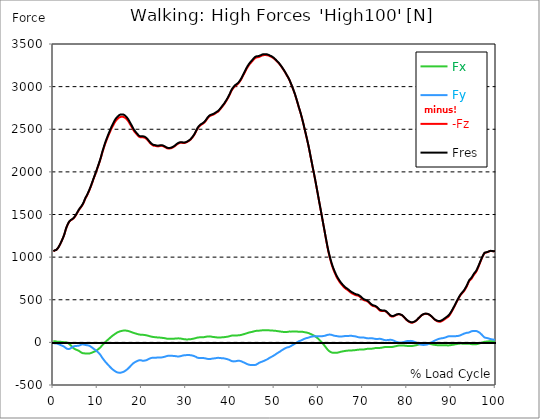
| Category |  Fx |  Fy |  -Fz |  Fres |
|---|---|---|---|---|
| 0.0 | 12.938 | -7.213 | 1069.33 | 1069.808 |
| 0.167348456675344 | 13.339 | -9.831 | 1074.685 | 1075.185 |
| 0.334696913350688 | 13.405 | -11.884 | 1079.215 | 1079.693 |
| 0.5020453700260321 | 11.732 | -11.949 | 1082.17 | 1082.659 |
| 0.669393826701376 | 9.733 | -11.634 | 1084.82 | 1085.353 |
| 0.83674228337672 | 9.049 | -14.752 | 1093.923 | 1094.532 |
| 1.0040907400520642 | 7.843 | -17.185 | 1103.537 | 1104.265 |
| 1.1621420602454444 | 6.713 | -20.639 | 1116.496 | 1117.365 |
| 1.3294905169207885 | 6.181 | -24.409 | 1131.606 | 1132.606 |
| 1.4968389735961325 | 6.224 | -28.178 | 1147.955 | 1149.095 |
| 1.6641874302714765 | 6.279 | -31.969 | 1165.639 | 1166.921 |
| 1.8315358869468206 | 6.246 | -35.445 | 1183.802 | 1185.214 |
| 1.9988843436221646 | 4.801 | -39.16 | 1203.333 | 1204.908 |
| 2.1662328002975086 | 3.672 | -42.962 | 1223.484 | 1225.232 |
| 2.333581256972853 | 2.466 | -46.927 | 1244.851 | 1246.752 |
| 2.5009297136481967 | 1.901 | -52.011 | 1269.661 | 1271.769 |
| 2.6682781703235405 | 2.194 | -59.658 | 1298.35 | 1300.826 |
| 2.8356266269988843 | 2.183 | -68.577 | 1328.407 | 1331.34 |
| 3.002975083674229 | -0.217 | -73.258 | 1352.816 | 1355.944 |
| 3.1703235403495724 | -5.138 | -75.04 | 1372.271 | 1375.508 |
| 3.337671997024917 | -9.44 | -77.777 | 1390.759 | 1394.17 |
| 3.4957233172182973 | -14.665 | -78.722 | 1407.151 | 1410.66 |
| 3.663071773893641 | -21.715 | -76.104 | 1419.502 | 1422.967 |
| 3.8304202305689854 | -29.264 | -71.966 | 1428.605 | 1431.962 |
| 3.997768687244329 | -38.215 | -66.046 | 1434.601 | 1437.871 |
| 4.165117143919673 | -47.926 | -59.539 | 1439.077 | 1442.336 |
| 4.332465600595017 | -57.236 | -53.727 | 1444.671 | 1448.147 |
| 4.499814057270361 | -65.698 | -48.948 | 1451.058 | 1454.784 |
| 4.667162513945706 | -72.292 | -46.036 | 1460.031 | 1464.072 |
| 4.834510970621049 | -78.842 | -42.495 | 1470.383 | 1474.761 |
| 5.001859427296393 | -82.839 | -41.192 | 1483.744 | 1488.274 |
| 5.169207883971737 | -86.218 | -40.811 | 1498.17 | 1502.83 |
| 5.336556340647081 | -89.205 | -41.137 | 1513.389 | 1518.19 |
| 5.503904797322425 | -92.616 | -40.247 | 1528.151 | 1533.007 |
| 5.671253253997769 | -96.353 | -39.204 | 1543.685 | 1548.595 |
| 5.82930457419115 | -101.675 | -37.335 | 1557.274 | 1562.282 |
| 5.996653030866494 | -107.335 | -34.641 | 1569.484 | 1574.633 |
| 6.164001487541838 | -113.309 | -30.818 | 1580.673 | 1586.028 |
| 6.331349944217181 | -119.403 | -26.668 | 1591.579 | 1597.184 |
| 6.498698400892526 | -124.574 | -22.747 | 1602.496 | 1608.362 |
| 6.66604685756787 | -127.279 | -21.856 | 1617.986 | 1623.961 |
| 6.833395314243213 | -128.191 | -24.452 | 1637.431 | 1643.427 |
| 7.000743770918558 | -128.68 | -27.537 | 1657.679 | 1663.675 |
| 7.168092227593902 | -129.071 | -30.915 | 1678.861 | 1684.836 |
| 7.335440684269246 | -130.625 | -31.296 | 1696.372 | 1702.379 |
| 7.50278914094459 | -130.788 | -32.349 | 1712.949 | 1718.956 |
| 7.6701375976199335 | -130.733 | -33.924 | 1730.177 | 1736.195 |
| 7.837486054295278 | -131.407 | -35.25 | 1748.166 | 1754.216 |
| 7.995537374488658 | -131.537 | -37.14 | 1766.915 | 1772.976 |
| 8.162885831164003 | -130.321 | -40.659 | 1787.369 | 1793.42 |
| 8.330234287839346 | -128.028 | -45.624 | 1809.128 | 1815.135 |
| 8.49758274451469 | -125.258 | -51.109 | 1831.907 | 1837.849 |
| 8.664931201190035 | -121.924 | -56.888 | 1855.598 | 1861.432 |
| 8.832279657865378 | -118.241 | -63.352 | 1879.898 | 1885.667 |
| 8.999628114540721 | -114.178 | -70.575 | 1904.687 | 1910.455 |
| 9.166976571216066 | -111.322 | -76.474 | 1928.129 | 1933.941 |
| 9.334325027891412 | -107.52 | -83.024 | 1951.701 | 1957.589 |
| 9.501673484566755 | -103.522 | -89.433 | 1974.85 | 1980.792 |
| 9.669021941242098 | -98.514 | -96.298 | 1998.096 | 2004.114 |
| 9.836370397917442 | -92.257 | -104.044 | 2022.798 | 2028.87 |
| 10.003718854592787 | -86.174 | -111.474 | 2047.522 | 2053.681 |
| 10.17106731126813 | -79.45 | -119.805 | 2072.43 | 2078.763 |
| 10.329118631461512 | -72.476 | -128.463 | 2098.131 | 2104.595 |
| 10.496467088136853 | -64.981 | -138.001 | 2124.224 | 2130.937 |
| 10.663815544812199 | -56.66 | -148.82 | 2151.652 | 2158.822 |
| 10.831164001487544 | -46.753 | -162.181 | 2181.981 | 2189.802 |
| 10.998512458162887 | -36.173 | -176.661 | 2213.516 | 2222.021 |
| 11.16586091483823 | -26.777 | -188.827 | 2242.248 | 2251.481 |
| 11.333209371513574 | -17.804 | -200.342 | 2269.774 | 2279.724 |
| 11.50055782818892 | -8.897 | -211.465 | 2296.724 | 2307.381 |
| 11.667906284864264 | -0.022 | -222.621 | 2322.741 | 2334.244 |
| 11.835254741539607 | 8.201 | -232.941 | 2346.628 | 2359 |
| 12.00260319821495 | 15.805 | -242.196 | 2369.135 | 2382.29 |
| 12.169951654890292 | 23.279 | -251.31 | 2391.035 | 2404.993 |
| 12.337300111565641 | 30.937 | -260.978 | 2412.424 | 2427.306 |
| 12.504648568240984 | 38.628 | -270.407 | 2432.835 | 2448.749 |
| 12.662699888434362 | 46.406 | -279.814 | 2453.213 | 2470.159 |
| 12.830048345109708 | 54.129 | -289.058 | 2473.494 | 2491.472 |
| 12.997396801785053 | 61.7 | -298.107 | 2493.242 | 2512.252 |
| 13.164745258460396 | 69.022 | -306.623 | 2511.438 | 2531.534 |
| 13.33209371513574 | 76.517 | -314.738 | 2528.546 | 2549.772 |
| 13.499442171811083 | 82.394 | -320.81 | 2543.743 | 2565.817 |
| 13.666790628486426 | 88.26 | -326.871 | 2559.321 | 2582.252 |
| 13.834139085161771 | 94.941 | -333.91 | 2576.114 | 2600.023 |
| 14.001487541837117 | 101.284 | -340.091 | 2590.236 | 2615.101 |
| 14.16883599851246 | 107.248 | -345.49 | 2602.196 | 2627.93 |
| 14.336184455187803 | 112.364 | -349.336 | 2612.07 | 2638.467 |
| 14.503532911863147 | 116.938 | -352.182 | 2620.652 | 2647.591 |
| 14.670881368538492 | 121.065 | -354.398 | 2628.788 | 2656.162 |
| 14.828932688731873 | 124.933 | -356.146 | 2636.327 | 2664.07 |
| 14.996281145407215 | 128.43 | -357.015 | 2641.704 | 2669.719 |
| 15.163629602082558 | 131.114 | -356.081 | 2644.702 | 2672.717 |
| 15.330978058757903 | 133.221 | -353.67 | 2646.158 | 2673.977 |
| 15.498326515433247 | 135.415 | -351.66 | 2646.299 | 2673.977 |
| 15.665674972108594 | 137.077 | -349.053 | 2645.767 | 2673.195 |
| 15.833023428783937 | 138.348 | -346.37 | 2644.626 | 2671.794 |
| 16.00037188545928 | 139.022 | -341.699 | 2641.182 | 2667.829 |
| 16.167720342134626 | 139.076 | -336.67 | 2636.664 | 2662.723 |
| 16.335068798809967 | 138.598 | -330.912 | 2629.983 | 2655.358 |
| 16.502417255485312 | 137.675 | -324.286 | 2621.988 | 2646.538 |
| 16.669765712160658 | 136.176 | -317.225 | 2612.385 | 2636.044 |
| 16.837114168836 | 134.514 | -310.11 | 2602.239 | 2625.008 |
| 17.004462625511344 | 132.08 | -301.615 | 2589.378 | 2611.093 |
| 17.16251394570472 | 129.788 | -292.903 | 2575.669 | 2596.33 |
| 17.32986240238007 | 126.638 | -283.431 | 2559.788 | 2579.33 |
| 17.497210859055414 | 123.401 | -275.034 | 2545.655 | 2564.231 |
| 17.664559315730756 | 120.153 | -266.04 | 2531.175 | 2548.719 |
| 17.8319077724061 | 117.046 | -256.665 | 2515.142 | 2531.642 |
| 17.999256229081443 | 114.135 | -248.192 | 2498.848 | 2514.457 |
| 18.166604685756788 | 111.376 | -241.414 | 2484.77 | 2499.641 |
| 18.333953142432133 | 108.258 | -235.266 | 2472.31 | 2486.464 |
| 18.501301599107478 | 105.553 | -230.845 | 2462.392 | 2476.068 |
| 18.668650055782823 | 103.012 | -225.804 | 2452.062 | 2465.217 |
| 18.835998512458165 | 100.1 | -221.448 | 2442.025 | 2454.691 |
| 19.00334696913351 | 97.819 | -217.701 | 2432.531 | 2444.784 |
| 19.170695425808855 | 95.723 | -214.138 | 2422.841 | 2434.714 |
| 19.338043882484197 | 93.365 | -210.336 | 2413.26 | 2424.742 |
| 19.496095202677576 | 91.388 | -208.793 | 2407.785 | 2419.072 |
| 19.66344365935292 | 90.27 | -209.26 | 2405.754 | 2417.051 |
| 19.830792116028263 | 89.357 | -210.064 | 2404.917 | 2416.258 |
| 19.998140572703612 | 88.933 | -213.355 | 2407.09 | 2418.691 |
| 20.165489029378953 | 88.76 | -216.158 | 2407.09 | 2418.93 |
| 20.3328374860543 | 88.238 | -215.952 | 2404.722 | 2416.53 |
| 20.500185942729644 | 87.532 | -214.724 | 2402.81 | 2414.477 |
| 20.667534399404985 | 86.381 | -213.529 | 2400.398 | 2411.935 |
| 20.83488285608033 | 84.773 | -211.878 | 2396.021 | 2407.372 |
| 21.002231312755672 | 83.187 | -209.586 | 2389.232 | 2400.366 |
| 21.16957976943102 | 81.525 | -206.316 | 2381.823 | 2392.664 |
| 21.336928226106362 | 79.233 | -201.895 | 2372.101 | 2382.551 |
| 21.504276682781704 | 76.409 | -196.725 | 2360.869 | 2370.906 |
| 21.67162513945705 | 74.117 | -192.89 | 2350.462 | 2360.185 |
| 21.82967645965043 | 71.672 | -188.784 | 2340.566 | 2349.908 |
| 21.997024916325774 | 69.272 | -185.156 | 2331.572 | 2340.588 |
| 22.16437337300112 | 67.099 | -182.516 | 2323.697 | 2332.463 |
| 22.33172182967646 | 65.394 | -180.528 | 2316.744 | 2325.348 |
| 22.499070286351806 | 63.58 | -179.963 | 2310.987 | 2319.514 |
| 22.666418743027148 | 62.559 | -179.236 | 2307.348 | 2315.821 |
| 22.833767199702496 | 61.624 | -179.007 | 2305.827 | 2314.257 |
| 23.00111565637784 | 60.951 | -179.496 | 2305.349 | 2313.779 |
| 23.168464113053183 | 60.18 | -179.551 | 2304.165 | 2312.562 |
| 23.335812569728528 | 58.996 | -178.703 | 2301.2 | 2309.488 |
| 23.50316102640387 | 57.768 | -178.377 | 2298.343 | 2306.566 |
| 23.670509483079215 | 57.247 | -178.269 | 2298.908 | 2307.12 |
| 23.83785793975456 | 56.769 | -178.28 | 2300.146 | 2308.337 |
| 23.995909259947936 | 56.497 | -178.356 | 2302.406 | 2310.585 |
| 24.163257716623285 | 56.074 | -178.16 | 2304.6 | 2312.747 |
| 24.330606173298627 | 54.857 | -177.063 | 2305.773 | 2313.79 |
| 24.49795462997397 | 53.771 | -176.107 | 2306.066 | 2313.985 |
| 24.665303086649313 | 52.728 | -174.782 | 2304.078 | 2311.867 |
| 24.83265154332466 | 51.805 | -173.174 | 2300.483 | 2308.141 |
| 25.0 | 50.849 | -171.23 | 2296.735 | 2304.22 |
| 25.167348456675345 | 49.252 | -168.818 | 2292.759 | 2300.07 |
| 25.334696913350694 | 47.296 | -166.092 | 2288.078 | 2295.182 |
| 25.502045370026035 | 45.298 | -163.072 | 2282.755 | 2289.642 |
| 25.669393826701377 | 43.473 | -160.226 | 2277.877 | 2284.558 |
| 25.836742283376722 | 42.256 | -158.075 | 2274.716 | 2281.234 |
| 26.004090740052067 | 41.528 | -156.837 | 2273.75 | 2280.191 |
| 26.17143919672741 | 41.344 | -156.706 | 2274.228 | 2280.68 |
| 26.329490516920792 | 41.061 | -156.619 | 2274.619 | 2281.082 |
| 26.49683897359613 | 40.866 | -156.641 | 2275.466 | 2281.951 |
| 26.66418743027148 | 41.083 | -156.967 | 2278.138 | 2284.656 |
| 26.831535886946828 | 41.583 | -157.738 | 2282.299 | 2288.871 |
| 26.998884343622166 | 42.061 | -158.444 | 2286.513 | 2293.107 |
| 27.166232800297514 | 42.615 | -159.074 | 2290.945 | 2297.572 |
| 27.333581256972852 | 43.473 | -159.878 | 2296.485 | 2303.155 |
| 27.5009297136482 | 44.331 | -160.66 | 2302.677 | 2309.39 |
| 27.668278170323543 | 45.352 | -162.138 | 2310.607 | 2317.418 |
| 27.835626626998888 | 46.308 | -163.691 | 2318.439 | 2325.337 |
| 28.002975083674233 | 46.84 | -164.712 | 2324.783 | 2331.724 |
| 28.170323540349575 | 47.036 | -164.984 | 2329.975 | 2336.906 |
| 28.33767199702492 | 46.971 | -165.081 | 2334.635 | 2341.544 |
| 28.50502045370026 | 46.677 | -164.462 | 2338.85 | 2345.683 |
| 28.663071773893645 | 45.808 | -162.681 | 2341.24 | 2347.91 |
| 28.830420230568986 | 44.526 | -160.508 | 2342.294 | 2348.768 |
| 28.99776868724433 | 42.756 | -157.901 | 2341.403 | 2347.671 |
| 29.165117143919673 | 40.963 | -155.663 | 2340.208 | 2346.291 |
| 29.33246560059502 | 39.258 | -153.817 | 2339.176 | 2345.107 |
| 29.499814057270367 | 37.716 | -152.166 | 2338.72 | 2344.51 |
| 29.66716251394571 | 36.455 | -150.905 | 2339.361 | 2345.031 |
| 29.834510970621054 | 35.5 | -149.841 | 2340.979 | 2346.541 |
| 30.00185942729639 | 35.011 | -149.233 | 2343.945 | 2349.43 |
| 30.169207883971744 | 34.967 | -149.428 | 2347.79 | 2353.265 |
| 30.33655634064708 | 35.076 | -149.439 | 2353.069 | 2358.512 |
| 30.50390479732243 | 35.228 | -149.363 | 2358.62 | 2364.041 |
| 30.671253253997772 | 35.402 | -149.004 | 2363.997 | 2369.385 |
| 30.829304574191156 | 36.075 | -149.309 | 2370.439 | 2375.827 |
| 30.996653030866494 | 36.89 | -149.808 | 2377.196 | 2382.616 |
| 31.164001487541842 | 38.193 | -151.438 | 2386.223 | 2391.752 |
| 31.331349944217187 | 39.769 | -153.23 | 2396.379 | 2402.028 |
| 31.498698400892525 | 41.583 | -155.468 | 2407.666 | 2413.466 |
| 31.666046857567874 | 43.44 | -157.988 | 2419.68 | 2425.644 |
| 31.833395314243212 | 45.341 | -160.812 | 2432.096 | 2438.255 |
| 32.00074377091856 | 47.372 | -164.278 | 2447.315 | 2453.745 |
| 32.1680922275939 | 49.762 | -168.253 | 2463.5 | 2470.235 |
| 32.33544068426925 | 52.75 | -173.478 | 2481.359 | 2488.506 |
| 32.50278914094459 | 55.183 | -177.823 | 2498.554 | 2506.082 |
| 32.670137597619934 | 56.888 | -180.724 | 2513.284 | 2521.073 |
| 32.83748605429528 | 58.094 | -182.668 | 2525.244 | 2533.163 |
| 33.004834510970625 | 58.757 | -183.483 | 2534.575 | 2542.538 |
| 33.162885831164004 | 59.43 | -183.917 | 2542.94 | 2550.913 |
| 33.33023428783935 | 59.691 | -183.983 | 2550.152 | 2558.137 |
| 33.497582744514695 | 59.745 | -183.972 | 2555.323 | 2563.296 |
| 33.664931201190036 | 59.952 | -183.852 | 2560.44 | 2568.391 |
| 33.83227965786538 | 60.212 | -183.7 | 2565.621 | 2573.551 |
| 33.99962811454073 | 60.918 | -184.222 | 2571.911 | 2579.873 |
| 34.16697657121607 | 62.244 | -185.503 | 2579.916 | 2587.944 |
| 34.33432502789141 | 64.025 | -187.176 | 2589.921 | 2598.068 |
| 34.50167348456676 | 65.861 | -189.077 | 2601.153 | 2609.42 |
| 34.6690219412421 | 67.686 | -191.38 | 2614.145 | 2622.585 |
| 34.83637039791744 | 68.685 | -193.39 | 2626.3 | 2634.882 |
| 35.00371885459279 | 69.739 | -195.182 | 2637.207 | 2645.929 |
| 35.17106731126814 | 70.358 | -196.073 | 2646.494 | 2655.271 |
| 35.338415767943474 | 70.369 | -195.942 | 2653.859 | 2662.582 |
| 35.49646708813686 | 69.522 | -194.987 | 2659.063 | 2667.677 |
| 35.6638155448122 | 68.088 | -193.433 | 2662.919 | 2671.359 |
| 35.831164001487544 | 66.274 | -191.445 | 2665.58 | 2673.792 |
| 35.998512458162885 | 64.253 | -189.371 | 2667.416 | 2675.411 |
| 36.165860914838234 | 63.221 | -188.697 | 2671.533 | 2679.43 |
| 36.333209371513576 | 62.341 | -188.284 | 2676.421 | 2684.264 |
| 36.50055782818892 | 60.984 | -186.992 | 2681.57 | 2689.272 |
| 36.667906284864266 | 60.169 | -185.764 | 2688.044 | 2695.605 |
| 36.83525474153961 | 59.3 | -184.222 | 2694.269 | 2701.688 |
| 37.002603198214956 | 58.04 | -182.331 | 2698.853 | 2706.098 |
| 37.1699516548903 | 57.149 | -181.408 | 2704.013 | 2711.182 |
| 37.337300111565646 | 56.834 | -181.397 | 2711.921 | 2719.068 |
| 37.50464856824098 | 57.116 | -182.049 | 2721.165 | 2728.334 |
| 37.66269988843437 | 57.66 | -182.929 | 2730.898 | 2738.111 |
| 37.83004834510971 | 57.866 | -183.95 | 2741.706 | 2748.963 |
| 37.99739680178505 | 58.572 | -185.243 | 2753.134 | 2760.456 |
| 38.16474525846039 | 59.484 | -186.34 | 2763.91 | 2771.318 |
| 38.33209371513574 | 60.115 | -186.774 | 2774.816 | 2782.235 |
| 38.49944217181109 | 60.669 | -187.274 | 2785.929 | 2793.37 |
| 38.666790628486424 | 61.472 | -188.545 | 2797.693 | 2805.21 |
| 38.83413908516178 | 62.678 | -190.848 | 2811.076 | 2818.723 |
| 39.001487541837115 | 63.688 | -192.966 | 2824.578 | 2832.356 |
| 39.16883599851246 | 64.742 | -194.856 | 2838.342 | 2846.239 |
| 39.336184455187805 | 66.317 | -197.344 | 2853.169 | 2861.218 |
| 39.503532911863154 | 68.24 | -200.266 | 2868.486 | 2876.752 |
| 39.670881368538495 | 70.152 | -203.275 | 2884.378 | 2892.851 |
| 39.83822982521384 | 72.205 | -206.447 | 2901.237 | 2909.916 |
| 39.996281145407224 | 74.931 | -211.27 | 2920.54 | 2929.567 |
| 40.163629602082565 | 77.571 | -216.115 | 2939.8 | 2949.196 |
| 40.33097805875791 | 79.722 | -219.851 | 2956.387 | 2966.066 |
| 40.498326515433256 | 81.004 | -221.915 | 2970.215 | 2980.035 |
| 40.6656749721086 | 81.308 | -222.6 | 2981.643 | 2991.496 |
| 40.83302342878393 | 81.742 | -223.175 | 2992.213 | 3002.076 |
| 41.00037188545929 | 81.514 | -222.578 | 3001.554 | 3011.32 |
| 41.16772034213463 | 81.503 | -221.698 | 3010.19 | 3019.837 |
| 41.33506879880997 | 81.84 | -220.069 | 3016.567 | 3026.072 |
| 41.50241725548531 | 81.764 | -217.842 | 3021.987 | 3031.297 |
| 41.66976571216066 | 81.992 | -215.995 | 3028.972 | 3038.14 |
| 41.837114168836 | 82.459 | -215.039 | 3037.434 | 3046.526 |
| 42.004462625511344 | 83.252 | -215.441 | 3047.906 | 3057.031 |
| 42.17181108218669 | 84.393 | -217.244 | 3060.648 | 3069.892 |
| 42.32986240238007 | 85.751 | -219.308 | 3073.759 | 3083.156 |
| 42.497210859055414 | 87.815 | -222.263 | 3088.196 | 3097.831 |
| 42.66455931573076 | 90.378 | -226.543 | 3104.99 | 3114.94 |
| 42.831907772406105 | 92.996 | -230.53 | 3121.99 | 3132.244 |
| 42.999256229081446 | 95.31 | -233.919 | 3138.566 | 3149.082 |
| 43.16660468575679 | 97.287 | -237.808 | 3155.61 | 3166.408 |
| 43.33395314243214 | 99.916 | -241.946 | 3172.545 | 3183.669 |
| 43.50130159910748 | 103.044 | -246.085 | 3189.784 | 3201.255 |
| 43.66865005578282 | 106.151 | -250.311 | 3206.557 | 3218.386 |
| 43.83599851245817 | 108.78 | -254.417 | 3221.286 | 3233.453 |
| 44.00334696913351 | 111.517 | -258.251 | 3235.028 | 3247.531 |
| 44.17069542580886 | 114.341 | -261.228 | 3248.335 | 3261.12 |
| 44.3380438824842 | 116.927 | -263.52 | 3260.892 | 3273.916 |
| 44.49609520267758 | 118.795 | -264.736 | 3271.462 | 3284.605 |
| 44.66344365935292 | 120.044 | -264.356 | 3280.793 | 3293.926 |
| 44.83079211602827 | 121.75 | -264.443 | 3290.374 | 3303.55 |
| 44.99814057270361 | 124.02 | -264.964 | 3300.335 | 3313.609 |
| 45.16548902937895 | 126.486 | -265.66 | 3310.654 | 3324.037 |
| 45.332837486054295 | 129.06 | -266.04 | 3320.311 | 3333.781 |
| 45.500185942729644 | 131.255 | -265.757 | 3328.991 | 3342.493 |
| 45.66753439940499 | 133.449 | -264.704 | 3336.051 | 3349.51 |
| 45.83488285608033 | 135.469 | -262.108 | 3341.429 | 3354.746 |
| 46.00223131275568 | 136.154 | -257.132 | 3343.797 | 3356.745 |
| 46.16957976943102 | 136.186 | -251.788 | 3344.72 | 3357.299 |
| 46.336928226106366 | 136.317 | -246.237 | 3345.752 | 3357.951 |
| 46.50427668278171 | 136.893 | -240.143 | 3347.49 | 3359.32 |
| 46.671625139457056 | 138.142 | -236.569 | 3351.705 | 3363.317 |
| 46.829676459650436 | 139.282 | -233.05 | 3355.724 | 3367.162 |
| 46.99702491632577 | 140.26 | -229.508 | 3359.874 | 3371.116 |
| 47.16437337300112 | 141.27 | -226.271 | 3364.686 | 3375.722 |
| 47.33172182967646 | 141.629 | -222.578 | 3368.075 | 3378.872 |
| 47.49907028635181 | 142.117 | -219.656 | 3369.27 | 3379.926 |
| 47.66641874302716 | 142.313 | -216.104 | 3369.856 | 3380.328 |
| 47.83376719970249 | 142.291 | -212.106 | 3370.269 | 3380.534 |
| 48.001115656377834 | 142.389 | -207.957 | 3370.269 | 3380.296 |
| 48.16846411305319 | 142.367 | -203.742 | 3369.639 | 3379.383 |
| 48.33581256972853 | 142.27 | -199.668 | 3368.759 | 3378.232 |
| 48.50316102640387 | 141.987 | -195.041 | 3366.956 | 3376.124 |
| 48.67050948307921 | 141.498 | -189.501 | 3364.056 | 3372.865 |
| 48.837857939754564 | 140.597 | -183.255 | 3359.787 | 3368.227 |
| 49.005206396429905 | 140.162 | -177.367 | 3355.518 | 3363.632 |
| 49.163257716623285 | 140.054 | -173.402 | 3352.259 | 3360.189 |
| 49.33060617329863 | 139.88 | -169.546 | 3348.598 | 3356.311 |
| 49.49795462997397 | 139.174 | -164.842 | 3343.427 | 3350.868 |
| 49.66530308664932 | 138.077 | -159.509 | 3337.54 | 3344.655 |
| 49.832651543324666 | 137.544 | -154.447 | 3331.163 | 3338.018 |
| 50.0 | 136.73 | -149.091 | 3323.798 | 3330.392 |
| 50.16734845667534 | 135.828 | -143.606 | 3316.031 | 3322.354 |
| 50.33469691335069 | 134.85 | -137.751 | 3307.808 | 3313.848 |
| 50.50204537002604 | 133.612 | -131.385 | 3298.532 | 3304.256 |
| 50.66939382670139 | 132.037 | -125.965 | 3289.602 | 3295.066 |
| 50.836742283376715 | 130.766 | -120.555 | 3281.466 | 3286.702 |
| 51.00409074005207 | 129.951 | -115.601 | 3272.515 | 3277.577 |
| 51.17143919672741 | 128.691 | -110.17 | 3261.707 | 3266.541 |
| 51.32949051692079 | 127.062 | -104.348 | 3250.16 | 3254.744 |
| 51.496838973596134 | 125.584 | -97.939 | 3238.417 | 3242.74 |
| 51.66418743027148 | 124.498 | -92.301 | 3226.196 | 3230.324 |
| 51.831535886946824 | 123.651 | -87.13 | 3213.541 | 3217.506 |
| 51.99888434362217 | 122.793 | -81.797 | 3200.473 | 3204.243 |
| 52.16623280029752 | 121.967 | -76.441 | 3187.503 | 3191.066 |
| 52.33358125697285 | 121.478 | -71.705 | 3173.718 | 3177.162 |
| 52.5009297136482 | 121.37 | -67.545 | 3158.967 | 3162.356 |
| 52.668278170323546 | 121.239 | -63.254 | 3143.574 | 3146.898 |
| 52.835626626998895 | 121.63 | -59.517 | 3128.051 | 3131.354 |
| 53.00297508367424 | 123.575 | -57.757 | 3113.658 | 3117.015 |
| 53.17032354034958 | 125.302 | -56.052 | 3098.494 | 3101.883 |
| 53.33767199702492 | 126.562 | -54.021 | 3081.83 | 3085.219 |
| 53.50502045370027 | 126.421 | -49.371 | 3061.441 | 3064.732 |
| 53.663071773893655 | 126.008 | -44.233 | 3040.226 | 3043.441 |
| 53.83042023056899 | 126.051 | -39.312 | 3018.978 | 3022.129 |
| 53.99776868724433 | 126.28 | -34.565 | 2997.22 | 3000.349 |
| 54.16511714391967 | 126.551 | -29.34 | 2974.941 | 2978.037 |
| 54.33246560059503 | 126.92 | -24.257 | 2951.282 | 2954.399 |
| 54.49981405727037 | 127.583 | -19.553 | 2927.242 | 2930.393 |
| 54.667162513945705 | 128.539 | -14.795 | 2902.421 | 2905.625 |
| 54.834510970621054 | 128.441 | -9.114 | 2874.862 | 2878.078 |
| 55.0018594272964 | 127.561 | -3.009 | 2845.793 | 2849.009 |
| 55.169207883971744 | 126.486 | 2.683 | 2816.573 | 2819.788 |
| 55.336556340647086 | 125.291 | 8.169 | 2786.287 | 2789.503 |
| 55.50390479732243 | 124.531 | 13.209 | 2755.969 | 2759.185 |
| 55.671253253997776 | 124.976 | 16.348 | 2728.552 | 2731.789 |
| 55.83860171067312 | 125.541 | 18.749 | 2701.004 | 2704.284 |
| 55.9966530308665 | 125.356 | 22.66 | 2669.73 | 2673.075 |
| 56.16400148754184 | 124.9 | 26.907 | 2637.337 | 2640.737 |
| 56.33134994421718 | 124.183 | 30.948 | 2603.619 | 2607.095 |
| 56.498698400892536 | 122.651 | 35.076 | 2568.793 | 2572.313 |
| 56.66604685756788 | 120.826 | 39.171 | 2532.435 | 2535.977 |
| 56.83339531424321 | 118.947 | 42.94 | 2495.415 | 2498.967 |
| 57.00074377091856 | 117.329 | 46.112 | 2458.829 | 2462.392 |
| 57.16809222759391 | 115.775 | 49.024 | 2422.287 | 2425.872 |
| 57.33544068426925 | 114.124 | 51.153 | 2385.169 | 2388.775 |
| 57.5027891409446 | 111.995 | 53.173 | 2347.182 | 2350.788 |
| 57.670137597619934 | 109.366 | 55.52 | 2307.924 | 2311.519 |
| 57.83748605429528 | 106.053 | 58.355 | 2265.613 | 2269.187 |
| 58.004834510970625 | 102.36 | 61.7 | 2221.413 | 2224.976 |
| 58.16288583116401 | 98.493 | 65.111 | 2176.843 | 2180.395 |
| 58.330234287839346 | 94.723 | 67.034 | 2132.979 | 2136.499 |
| 58.497582744514695 | 90.693 | 68.783 | 2088.616 | 2092.081 |
| 58.66493120119004 | 86.533 | 70.271 | 2044.6 | 2047.978 |
| 58.832279657865385 | 82.427 | 71.01 | 2002.105 | 2005.418 |
| 58.999628114540734 | 77.582 | 70.977 | 1958.784 | 1961.967 |
| 59.16697657121607 | 72.064 | 71.086 | 1913.953 | 1917.006 |
| 59.33432502789142 | 65.915 | 71.51 | 1867.917 | 1870.85 |
| 59.50167348456676 | 59.484 | 72.085 | 1821.25 | 1824.064 |
| 59.66902194124211 | 52.923 | 72.802 | 1774.063 | 1776.767 |
| 59.83637039791745 | 45.591 | 73.041 | 1726.657 | 1729.232 |
| 60.00371885459278 | 37.107 | 72.987 | 1678.927 | 1681.414 |
| 60.17106731126813 | 28.602 | 72.813 | 1632.054 | 1634.465 |
| 60.33841576794349 | 19.694 | 72.639 | 1584.855 | 1587.234 |
| 60.49646708813685 | 10.244 | 72.335 | 1537.45 | 1539.818 |
| 60.6638155448122 | 1.206 | 72.259 | 1490.86 | 1493.271 |
| 60.831164001487544 | -8.668 | 72.933 | 1442.977 | 1445.518 |
| 60.99851245816289 | -18.825 | 73.899 | 1394.496 | 1397.266 |
| 61.16586091483824 | -29.047 | 75.181 | 1347.906 | 1351.197 |
| 61.333209371513576 | -40.029 | 77.158 | 1299.903 | 1303.901 |
| 61.50055782818892 | -51.229 | 79.418 | 1251.683 | 1256.474 |
| 61.667906284864266 | -62.7 | 82.003 | 1203.453 | 1209.156 |
| 61.835254741539615 | -73.726 | 85.555 | 1156.743 | 1163.532 |
| 62.002603198214956 | -84.512 | 88.727 | 1110.663 | 1118.745 |
| 62.16995165489029 | -93.496 | 90.096 | 1068.374 | 1077.64 |
| 62.33730011156564 | -100.882 | 91.019 | 1030.344 | 1040.642 |
| 62.504648568240995 | -107.389 | 91.53 | 995.018 | 1006.196 |
| 62.67199702491633 | -112.582 | 90.845 | 962.354 | 974.433 |
| 62.83004834510971 | -116.796 | 89.574 | 931.547 | 944.408 |
| 62.99739680178505 | -119.849 | 87.087 | 901.859 | 915.22 |
| 63.1647452584604 | -121.272 | 83.828 | 876.277 | 889.856 |
| 63.33209371513575 | -122.26 | 80.862 | 852.488 | 866.24 |
| 63.4994421718111 | -122.771 | 78.212 | 830.719 | 844.612 |
| 63.666790628486424 | -122.999 | 76.735 | 810.547 | 824.625 |
| 63.83413908516177 | -122.988 | 75.431 | 791.135 | 805.343 |
| 64.00148754183712 | -122.988 | 74.649 | 771.929 | 786.333 |
| 64.16883599851248 | -121.706 | 72.943 | 755.331 | 769.627 |
| 64.3361844551878 | -119.632 | 71.781 | 740.971 | 755.103 |
| 64.50353291186315 | -117.285 | 69.956 | 726.838 | 740.699 |
| 64.6708813685385 | -115.113 | 69.75 | 712.999 | 726.762 |
| 64.83822982521384 | -112.734 | 69.554 | 700.691 | 714.27 |
| 65.00557828188919 | -110.311 | 69.543 | 689.666 | 703.005 |
| 65.16362960208257 | -108.171 | 69.706 | 679.085 | 692.208 |
| 65.3309780587579 | -106.27 | 70.228 | 668.809 | 681.812 |
| 65.49832651543326 | -104.608 | 70.782 | 658.968 | 671.905 |
| 65.6656749721086 | -103.348 | 72.487 | 649.713 | 662.683 |
| 65.83302342878395 | -101.914 | 73.573 | 641.077 | 654.036 |
| 66.00037188545929 | -100.383 | 74.16 | 633.125 | 646.03 |
| 66.16772034213463 | -98.862 | 73.975 | 626.814 | 639.556 |
| 66.33506879880998 | -97.841 | 74.486 | 621.209 | 633.929 |
| 66.50241725548531 | -96.918 | 75.127 | 615.745 | 628.465 |
| 66.66976571216065 | -96.298 | 75.659 | 608.858 | 621.654 |
| 66.83711416883601 | -96.309 | 76.104 | 601.352 | 614.3 |
| 67.00446262551135 | -96.396 | 76.811 | 593.378 | 606.555 |
| 67.1718110821867 | -95.972 | 76.941 | 586.6 | 599.842 |
| 67.32986240238007 | -95.386 | 76.691 | 580.571 | 593.78 |
| 67.49721085905541 | -94.343 | 76.311 | 575.585 | 588.664 |
| 67.66455931573076 | -93.528 | 74.888 | 571.381 | 584.286 |
| 67.83190777240611 | -92.931 | 73.563 | 566.862 | 579.637 |
| 67.99925622908145 | -92.344 | 72.4 | 562.18 | 574.836 |
| 68.16660468575678 | -91.551 | 71.553 | 557.509 | 570.012 |
| 68.33395314243214 | -90.617 | 70.499 | 553.295 | 565.602 |
| 68.50130159910749 | -89.096 | 67.751 | 551.502 | 563.223 |
| 68.66865005578282 | -87.597 | 64.829 | 550.34 | 561.453 |
| 68.83599851245816 | -86.185 | 61.983 | 549.373 | 559.899 |
| 69.00334696913352 | -85.229 | 59.821 | 546.038 | 556.228 |
| 69.17069542580886 | -84.664 | 58.702 | 540.531 | 550.601 |
| 69.3380438824842 | -84.653 | 57.746 | 533.992 | 544.061 |
| 69.50539233915956 | -84.523 | 57.095 | 527.029 | 537.12 |
| 69.66344365935292 | -84.512 | 57.486 | 518.599 | 528.864 |
| 69.83079211602826 | -84.523 | 58.018 | 510.028 | 520.457 |
| 69.99814057270362 | -84.306 | 58.137 | 502.207 | 512.755 |
| 70.16548902937896 | -83.589 | 57.182 | 496.385 | 506.824 |
| 70.33283748605429 | -82.144 | 55.215 | 493.061 | 503.12 |
| 70.50018594272964 | -80.221 | 53.065 | 490.964 | 500.523 |
| 70.667534399405 | -78.299 | 50.816 | 488.944 | 498.014 |
| 70.83488285608033 | -76.735 | 48.991 | 485.837 | 494.538 |
| 71.00223131275568 | -75.605 | 47.557 | 481.253 | 489.726 |
| 71.16957976943102 | -74.801 | 46.808 | 475.029 | 483.425 |
| 71.33692822610637 | -74.464 | 46.873 | 467.403 | 475.908 |
| 71.50427668278171 | -74.497 | 47.242 | 458.658 | 467.381 |
| 71.67162513945706 | -74.551 | 47.709 | 449.718 | 458.68 |
| 71.8389735961324 | -74.551 | 48.079 | 441.028 | 450.196 |
| 71.99702491632577 | -74.193 | 47.992 | 433.457 | 442.701 |
| 72.16437337300113 | -73.248 | 47.079 | 428.416 | 437.498 |
| 72.33172182967647 | -71.542 | 45.548 | 425.994 | 434.684 |
| 72.49907028635181 | -69.793 | 43.918 | 423.8 | 432.055 |
| 72.66641874302715 | -68.066 | 42.386 | 421.529 | 429.394 |
| 72.8337671997025 | -66.339 | 40.92 | 419.281 | 426.765 |
| 73.00111565637783 | -65.122 | 39.801 | 415.283 | 422.529 |
| 73.16846411305319 | -64.938 | 39.942 | 407.538 | 414.925 |
| 73.33581256972853 | -64.981 | 40.366 | 399.054 | 406.68 |
| 73.50316102640387 | -65.035 | 41.007 | 390.245 | 398.109 |
| 73.67050948307921 | -65.057 | 41.68 | 381.652 | 389.734 |
| 73.83785793975457 | -65.014 | 41.952 | 373.755 | 382.011 |
| 74.00520639642991 | -64.362 | 40.659 | 369.323 | 377.427 |
| 74.16325771662328 | -62.819 | 38.508 | 367.922 | 375.623 |
| 74.33060617329863 | -61.005 | 35.804 | 368.041 | 375.2 |
| 74.49795462997398 | -59.159 | 33.11 | 368.172 | 374.787 |
| 74.66530308664932 | -57.225 | 29.981 | 369.062 | 375.059 |
| 74.83265154332466 | -55.357 | 27.255 | 369.377 | 374.82 |
| 75.00000000000001 | -54.118 | 25.995 | 367.085 | 372.278 |
| 75.16734845667534 | -53.488 | 25.625 | 362.653 | 367.813 |
| 75.3346969133507 | -53.325 | 26.027 | 355.897 | 361.176 |
| 75.50204537002605 | -53.325 | 26.592 | 347.836 | 353.333 |
| 75.66939382670138 | -53.543 | 27.179 | 339.168 | 344.936 |
| 75.83674228337672 | -53.966 | 28.113 | 330.065 | 336.17 |
| 76.00409074005208 | -54.922 | 29.97 | 319.224 | 325.991 |
| 76.17143919672742 | -55.302 | 30.72 | 310.99 | 318.083 |
| 76.33878765340276 | -55.291 | 30.437 | 305.341 | 312.609 |
| 76.49683897359614 | -54.661 | 28.765 | 303.038 | 310.262 |
| 76.66418743027148 | -53.423 | 26.027 | 302.484 | 309.285 |
| 76.83153588694682 | -51.913 | 22.899 | 303.049 | 309.263 |
| 76.99888434362218 | -50.012 | 19.01 | 306.167 | 311.501 |
| 77.16623280029752 | -47.959 | 15.056 | 311.196 | 315.954 |
| 77.33358125697285 | -45.645 | 10.884 | 317.551 | 321.722 |
| 77.5009297136482 | -43.603 | 7.626 | 321.288 | 325.036 |
| 77.66827817032356 | -41.811 | 4.801 | 324.84 | 328.294 |
| 77.83562662699889 | -39.997 | 1.89 | 327.436 | 330.554 |
| 78.00297508367423 | -38.204 | -0.815 | 329.468 | 332.259 |
| 78.17032354034959 | -37.096 | -2.042 | 330.195 | 332.792 |
| 78.33767199702493 | -36.618 | -1.901 | 327.436 | 329.956 |
| 78.50502045370027 | -36.097 | -1.966 | 324.666 | 327.11 |
| 78.67236891037561 | -35.662 | -1.858 | 321.635 | 324.014 |
| 78.83042023056899 | -35.63 | -0.999 | 317.432 | 319.811 |
| 78.99776868724433 | -35.999 | 0.652 | 310.762 | 313.239 |
| 79.16511714391969 | -36.705 | 2.966 | 301.996 | 304.668 |
| 79.33246560059503 | -37.574 | 5.421 | 292.349 | 295.304 |
| 79.49981405727036 | -38.693 | 8.484 | 282.54 | 285.799 |
| 79.66716251394571 | -39.899 | 11.493 | 272.905 | 276.414 |
| 79.83451097062107 | -40.887 | 13.774 | 264.193 | 267.963 |
| 80.00185942729641 | -41.68 | 15.403 | 256.383 | 260.456 |
| 80.16920788397174 | -42.202 | 16.338 | 249.528 | 253.895 |
| 80.33655634064709 | -42.636 | 17.022 | 243.641 | 248.29 |
| 80.50390479732243 | -42.886 | 17.348 | 238.959 | 243.793 |
| 80.67125325399778 | -43.017 | 17.424 | 235.298 | 240.284 |
| 80.83860171067312 | -43.158 | 17.587 | 231.855 | 237.015 |
| 80.99665303086651 | -42.691 | 16.707 | 230.214 | 235.309 |
| 81.16400148754184 | -41.854 | 14.882 | 230.91 | 235.765 |
| 81.3313499442172 | -40.409 | 12.047 | 233.984 | 238.405 |
| 81.49869840089255 | -38.867 | 8.821 | 237.134 | 241.153 |
| 81.66604685756786 | -37.335 | 5.41 | 241.175 | 244.803 |
| 81.83339531424322 | -35.869 | 2.053 | 245.965 | 249.213 |
| 82.00074377091858 | -33.794 | -2.14 | 252.603 | 255.264 |
| 82.16809222759392 | -31.632 | -6.04 | 260.022 | 262.368 |
| 82.33544068426926 | -29.362 | -9.874 | 269.092 | 271.373 |
| 82.50278914094459 | -27.027 | -13.839 | 278.782 | 281.085 |
| 82.67013759761994 | -24.745 | -17.522 | 287.266 | 289.547 |
| 82.83748605429528 | -22.497 | -21.139 | 295.597 | 297.9 |
| 83.00483451097062 | -20.422 | -24.148 | 304.744 | 307.112 |
| 83.17218296764597 | -18.304 | -27.244 | 313.032 | 315.433 |
| 83.33023428783935 | -16.978 | -28.743 | 319.018 | 321.451 |
| 83.4975827445147 | -15.957 | -29.655 | 324.449 | 326.947 |
| 83.66493120119004 | -15.219 | -29.807 | 328.794 | 331.336 |
| 83.83227965786537 | -14.654 | -29.688 | 331.977 | 334.519 |
| 83.99962811454073 | -14.295 | -29.308 | 334.139 | 336.68 |
| 84.16697657121607 | -14.198 | -28.352 | 334.921 | 337.495 |
| 84.33432502789142 | -14.285 | -27.048 | 334.769 | 337.343 |
| 84.50167348456677 | -14.6 | -25.223 | 334.204 | 336.691 |
| 84.6690219412421 | -15.251 | -22.225 | 332.205 | 334.66 |
| 84.83637039791745 | -15.979 | -19.021 | 328.501 | 330.825 |
| 85.0037188545928 | -17.196 | -14.839 | 323.678 | 325.796 |
| 85.17106731126813 | -18.706 | -10.113 | 318.149 | 320.126 |
| 85.33841576794349 | -20.476 | -5.029 | 311.327 | 313.456 |
| 85.50576422461883 | -22.019 | -0.435 | 303.679 | 305.819 |
| 85.66381554481221 | -23.703 | 4.584 | 295.293 | 297.705 |
| 85.83116400148755 | -25.495 | 9.69 | 285.919 | 288.58 |
| 85.99851245816289 | -27.092 | 14.187 | 277.163 | 280.064 |
| 86.16586091483823 | -28.645 | 18.738 | 268.951 | 272.134 |
| 86.33320937151358 | -29.851 | 22.681 | 262.52 | 266.225 |
| 86.50055782818893 | -30.981 | 26.701 | 256.752 | 261.239 |
| 86.66790628486427 | -32.175 | 31.057 | 251.299 | 256.622 |
| 86.83525474153961 | -33.207 | 35.076 | 247.139 | 253.254 |
| 87.00260319821496 | -34.033 | 38.302 | 244.456 | 251.419 |
| 87.16995165489031 | -34.511 | 40.985 | 242.88 | 250.582 |
| 87.33730011156564 | -34.88 | 43.386 | 241.925 | 250.278 |
| 87.504648568241 | -35.174 | 45.352 | 242.359 | 251.223 |
| 87.67199702491634 | -35.087 | 47.155 | 245.216 | 254.536 |
| 87.83004834510972 | -34.859 | 48.578 | 249.583 | 259.24 |
| 87.99739680178506 | -34.424 | 49.567 | 254.851 | 264.758 |
| 88.1647452584604 | -33.979 | 50.566 | 260.131 | 270.287 |
| 88.33209371513574 | -33.544 | 52.467 | 266.626 | 276.881 |
| 88.49944217181108 | -33.707 | 55.259 | 272.199 | 282.508 |
| 88.66679062848644 | -33.664 | 57.942 | 278.977 | 289.319 |
| 88.83413908516178 | -34.12 | 61.407 | 284.995 | 295.576 |
| 89.00148754183712 | -35.087 | 65.611 | 289.84 | 300.888 |
| 89.16883599851246 | -35.489 | 68.664 | 296.217 | 307.688 |
| 89.33618445518782 | -35.543 | 71.151 | 303.582 | 315.302 |
| 89.50353291186315 | -34.815 | 72.335 | 313.163 | 324.775 |
| 89.6708813685385 | -33.566 | 72.704 | 325.112 | 336.355 |
| 89.83822982521386 | -32.11 | 72.694 | 339.146 | 349.835 |
| 90.00557828188919 | -30.709 | 72.65 | 354.202 | 364.304 |
| 90.16362960208257 | -29.188 | 72.313 | 369.812 | 379.295 |
| 90.3309780587579 | -27.733 | 72.205 | 386.508 | 395.274 |
| 90.49832651543326 | -26.364 | 72.346 | 402.661 | 410.862 |
| 90.66567497210859 | -24.941 | 72.65 | 418.727 | 426.472 |
| 90.83302342878395 | -23.149 | 72.824 | 435.901 | 443.244 |
| 91.00037188545929 | -21.541 | 73.248 | 453.216 | 460.255 |
| 91.16772034213463 | -19.879 | 73.508 | 471.042 | 477.733 |
| 91.33506879880998 | -18.358 | 74.312 | 488.248 | 494.679 |
| 91.50241725548533 | -16.826 | 75.507 | 504.597 | 510.963 |
| 91.66976571216065 | -15.403 | 77.126 | 520.543 | 526.92 |
| 91.83711416883601 | -14.708 | 79.602 | 535.708 | 542.28 |
| 92.00446262551137 | -14.393 | 82.611 | 549.221 | 556.119 |
| 92.1718110821867 | -14.556 | 86.077 | 561.344 | 568.655 |
| 92.33915953886203 | -14.6 | 89.607 | 571.446 | 579.17 |
| 92.49721085905541 | -15.501 | 94.18 | 580.462 | 588.751 |
| 92.66455931573077 | -16.707 | 99.101 | 589.25 | 598.147 |
| 92.83190777240611 | -17.098 | 102.425 | 600.515 | 609.792 |
| 92.99925622908145 | -17.239 | 105.032 | 613.453 | 622.979 |
| 93.1666046857568 | -17.511 | 107.759 | 627.802 | 637.611 |
| 93.33395314243214 | -17.446 | 110.192 | 642.75 | 652.765 |
| 93.50130159910749 | -17.587 | 112.788 | 659.217 | 669.45 |
| 93.66865005578283 | -17.055 | 113.95 | 678.738 | 688.905 |
| 93.83599851245818 | -15.447 | 114.005 | 698.943 | 709.002 |
| 94.00334696913353 | -14.947 | 115.493 | 716.475 | 726.632 |
| 94.17069542580886 | -16.544 | 119.838 | 728.326 | 739.059 |
| 94.3380438824842 | -18.478 | 124.857 | 736.191 | 747.727 |
| 94.50539233915954 | -20.389 | 129.832 | 743.838 | 756.178 |
| 94.66344365935292 | -21.269 | 132.786 | 756.439 | 769.138 |
| 94.83079211602828 | -21.03 | 132.982 | 770.952 | 783.477 |
| 94.99814057270362 | -21.226 | 133.699 | 785.432 | 797.848 |
| 95.16548902937897 | -21.139 | 133.96 | 799.054 | 811.264 |
| 95.33283748605432 | -21.302 | 134.383 | 809.221 | 821.312 |
| 95.50018594272963 | -21.454 | 134.796 | 819.389 | 831.36 |
| 95.66753439940499 | -20.911 | 133.569 | 834.282 | 845.894 |
| 95.83488285608034 | -19.379 | 129.864 | 852.585 | 863.557 |
| 96.00223131275567 | -17.587 | 125.975 | 872.627 | 882.838 |
| 96.16957976943102 | -15.295 | 121.272 | 892.756 | 902.163 |
| 96.33692822610638 | -12.612 | 115.341 | 914.688 | 923.269 |
| 96.50427668278171 | -9.722 | 108.28 | 936.707 | 944.376 |
| 96.67162513945706 | -6.811 | 101.045 | 958.66 | 965.384 |
| 96.8389735961324 | -3.769 | 92.268 | 979.984 | 985.828 |
| 96.99702491632577 | -0.739 | 82.959 | 1000.406 | 1005.435 |
| 97.16437337300111 | 1.999 | 73.693 | 1017.83 | 1022.229 |
| 97.33172182967647 | 4.638 | 64.59 | 1034.417 | 1038.187 |
| 97.49907028635181 | 6.637 | 57.594 | 1048.137 | 1051.396 |
| 97.66641874302715 | 7.647 | 55.226 | 1050.299 | 1053.297 |
| 97.8337671997025 | 8.386 | 53.304 | 1053.72 | 1056.49 |
| 98.00111565637785 | 9.299 | 51.555 | 1056.338 | 1058.848 |
| 98.16846411305319 | 10.222 | 49.686 | 1058.446 | 1060.738 |
| 98.33581256972855 | 11.243 | 46.058 | 1063.855 | 1065.843 |
| 98.50316102640389 | 11.96 | 44.103 | 1066.441 | 1068.255 |
| 98.67050948307921 | 13.035 | 41.376 | 1070.036 | 1071.687 |
| 98.83785793975456 | 13.893 | 38.9 | 1072.469 | 1073.979 |
| 99.0052063964299 | 14.393 | 36.705 | 1073.382 | 1074.772 |
| 99.17255485310525 | 14.198 | 35.478 | 1071.416 | 1072.73 |
| 99.33060617329863 | 13.644 | 34.826 | 1067.918 | 1069.167 |
| 99.49795462997399 | 13.416 | 33.099 | 1067.625 | 1068.765 |
| 99.66530308664933 | 13.502 | 30.481 | 1069.384 | 1070.395 |
| 99.83265154332467 | 13.883 | 27.352 | 1072.046 | 1072.904 |
| 100.0 | 14.382 | 24.115 | 1074.935 | 1075.631 |